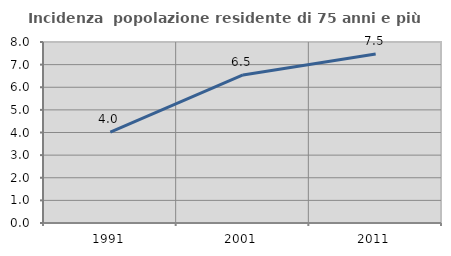
| Category | Incidenza  popolazione residente di 75 anni e più |
|---|---|
| 1991.0 | 4.019 |
| 2001.0 | 6.542 |
| 2011.0 | 7.465 |